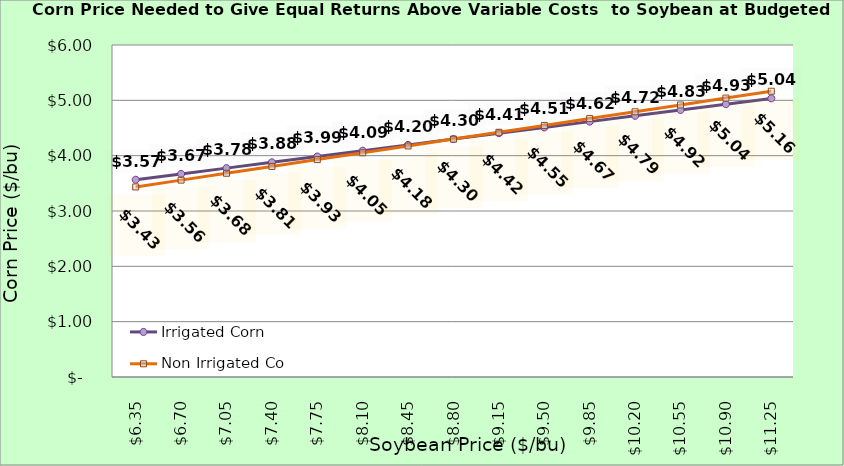
| Category | Irrigated Corn | Non Irrigated Corn |
|---|---|---|
| 6.350000000000003 | 3.565 | 3.435 |
| 6.700000000000003 | 3.67 | 3.558 |
| 7.0500000000000025 | 3.775 | 3.682 |
| 7.400000000000002 | 3.88 | 3.805 |
| 7.750000000000002 | 3.985 | 3.929 |
| 8.100000000000001 | 4.09 | 4.052 |
| 8.450000000000001 | 4.195 | 4.176 |
| 8.8 | 4.3 | 4.299 |
| 9.15 | 4.405 | 4.423 |
| 9.5 | 4.51 | 4.546 |
| 9.85 | 4.615 | 4.67 |
| 10.2 | 4.72 | 4.793 |
| 10.549999999999999 | 4.825 | 4.917 |
| 10.899999999999999 | 4.93 | 5.041 |
| 11.249999999999998 | 5.035 | 5.164 |